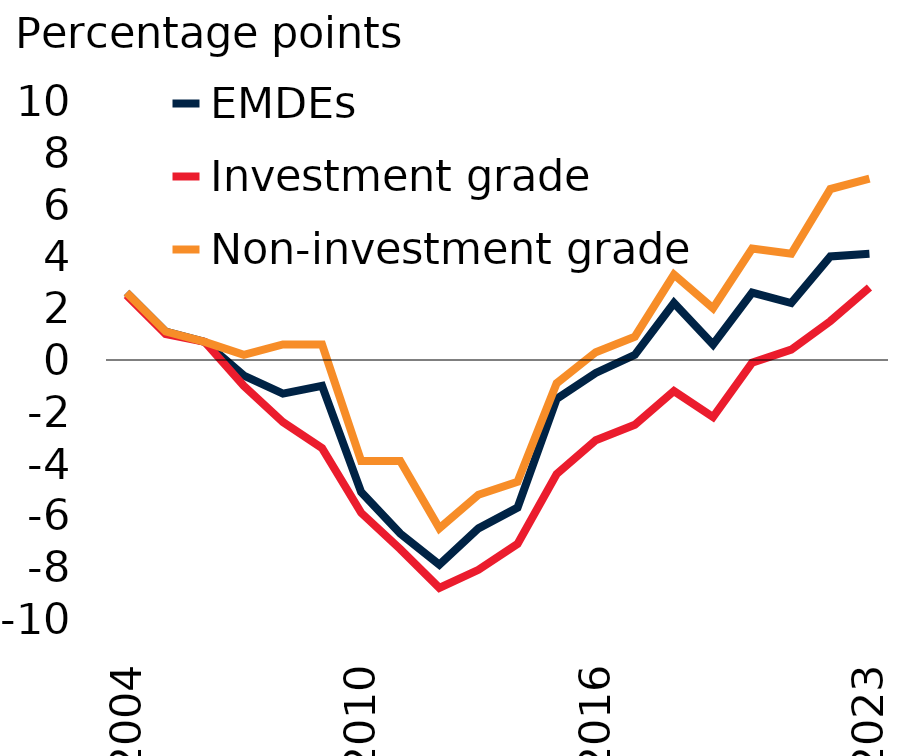
| Category | EMDEs | Investment grade | Non-investment grade |
|---|---|---|---|
| 2004.0 | 2.6 | 2.5 | 2.6 |
| nan | 1.1 | 1 | 1.1 |
| nan | 0.7 | 0.7 | 0.7 |
| nan | -0.6 | -1 | 0.2 |
| nan | -1.3 | -2.4 | 0.6 |
| nan | -1 | -3.4 | 0.6 |
| 2010.0 | -5.1 | -5.9 | -3.9 |
| nan | -6.7 | -7.3 | -3.9 |
| nan | -7.9 | -8.8 | -6.5 |
| nan | -6.5 | -8.1 | -5.2 |
| nan | -5.7 | -7.1 | -4.7 |
| nan | -1.5 | -4.4 | -0.9 |
| 2016.0 | -0.5 | -3.1 | 0.3 |
| nan | 0.2 | -2.5 | 0.9 |
| nan | 2.2 | -1.2 | 3.3 |
| nan | 0.6 | -2.2 | 2 |
| nan | 2.6 | -0.1 | 4.3 |
| nan | 2.2 | 0.4 | 4.1 |
| nan | 4 | 1.5 | 6.6 |
| 2023.0 | 4.1 | 2.8 | 7 |